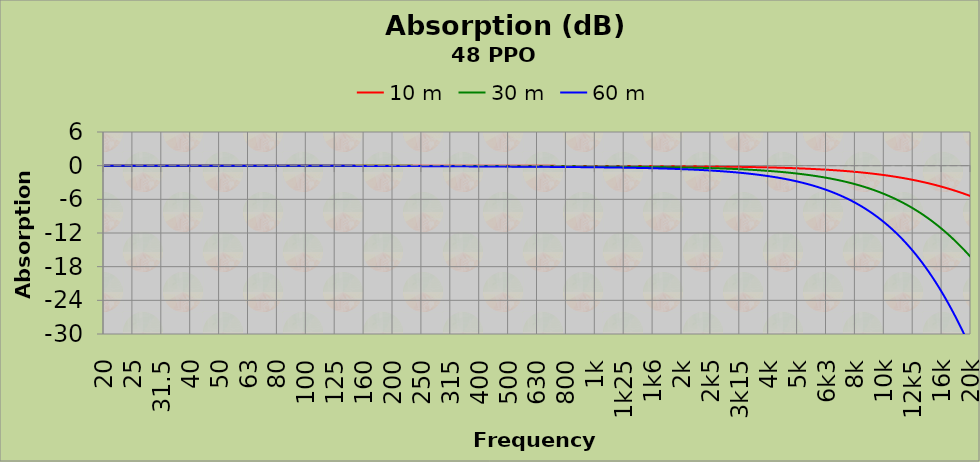
| Category | 10 m | 30 m | 60 m |
|---|---|---|---|
| 20 | 0 | 0 | -0.001 |
|  | 0 | 0 | -0.001 |
|  | 0 | 0 | -0.001 |
|  | 0 | 0 | -0.001 |
|  | 0 | 0 | -0.001 |
|  | 0 | 0 | -0.001 |
|  | 0 | 0 | -0.001 |
|  | 0 | 0 | -0.001 |
|  | 0 | -0.001 | -0.001 |
|  | 0 | -0.001 | -0.001 |
|  | 0 | -0.001 | -0.001 |
|  | 0 | -0.001 | -0.001 |
|  | 0 | -0.001 | -0.001 |
|  | 0 | -0.001 | -0.001 |
|  | 0 | -0.001 | -0.001 |
|  | 0 | -0.001 | -0.001 |
| 25 | 0 | -0.001 | -0.001 |
|  | 0 | -0.001 | -0.001 |
|  | 0 | -0.001 | -0.001 |
|  | 0 | -0.001 | -0.001 |
|  | 0 | -0.001 | -0.001 |
|  | 0 | -0.001 | -0.001 |
|  | 0 | -0.001 | -0.002 |
|  | 0 | -0.001 | -0.002 |
|  | 0 | -0.001 | -0.002 |
|  | 0 | -0.001 | -0.002 |
|  | 0 | -0.001 | -0.002 |
|  | 0 | -0.001 | -0.002 |
|  | 0 | -0.001 | -0.002 |
|  | 0 | -0.001 | -0.002 |
|  | 0 | -0.001 | -0.002 |
|  | 0 | -0.001 | -0.002 |
| 31,5 | 0 | -0.001 | -0.002 |
|  | 0 | -0.001 | -0.002 |
|  | 0 | -0.001 | -0.002 |
|  | 0 | -0.001 | -0.002 |
|  | 0 | -0.001 | -0.002 |
|  | 0 | -0.001 | -0.002 |
|  | 0 | -0.001 | -0.002 |
|  | 0 | -0.001 | -0.002 |
|  | 0 | -0.001 | -0.003 |
|  | 0 | -0.001 | -0.003 |
|  | 0 | -0.001 | -0.003 |
|  | 0 | -0.001 | -0.003 |
|  | 0 | -0.001 | -0.003 |
|  | 0 | -0.001 | -0.003 |
|  | -0.001 | -0.002 | -0.003 |
|  | -0.001 | -0.002 | -0.003 |
| 40 | -0.001 | -0.002 | -0.003 |
|  | -0.001 | -0.002 | -0.003 |
|  | -0.001 | -0.002 | -0.003 |
|  | -0.001 | -0.002 | -0.004 |
|  | -0.001 | -0.002 | -0.004 |
|  | -0.001 | -0.002 | -0.004 |
|  | -0.001 | -0.002 | -0.004 |
|  | -0.001 | -0.002 | -0.004 |
|  | -0.001 | -0.002 | -0.004 |
|  | -0.001 | -0.002 | -0.004 |
|  | -0.001 | -0.002 | -0.004 |
|  | -0.001 | -0.002 | -0.004 |
|  | -0.001 | -0.002 | -0.005 |
|  | -0.001 | -0.002 | -0.005 |
|  | -0.001 | -0.002 | -0.005 |
|  | -0.001 | -0.002 | -0.005 |
| 50 | -0.001 | -0.003 | -0.005 |
|  | -0.001 | -0.003 | -0.005 |
|  | -0.001 | -0.003 | -0.005 |
|  | -0.001 | -0.003 | -0.006 |
|  | -0.001 | -0.003 | -0.006 |
|  | -0.001 | -0.003 | -0.006 |
|  | -0.001 | -0.003 | -0.006 |
|  | -0.001 | -0.003 | -0.006 |
|  | -0.001 | -0.003 | -0.006 |
|  | -0.001 | -0.003 | -0.007 |
|  | -0.001 | -0.003 | -0.007 |
|  | -0.001 | -0.003 | -0.007 |
|  | -0.001 | -0.004 | -0.007 |
|  | -0.001 | -0.004 | -0.007 |
|  | -0.001 | -0.004 | -0.007 |
|  | -0.001 | -0.004 | -0.008 |
| 63 | -0.001 | -0.004 | -0.008 |
|  | -0.001 | -0.004 | -0.008 |
|  | -0.001 | -0.004 | -0.008 |
|  | -0.001 | -0.004 | -0.009 |
|  | -0.001 | -0.004 | -0.009 |
|  | -0.002 | -0.005 | -0.009 |
|  | -0.002 | -0.005 | -0.009 |
|  | -0.002 | -0.005 | -0.01 |
|  | -0.002 | -0.005 | -0.01 |
|  | -0.002 | -0.005 | -0.01 |
|  | -0.002 | -0.005 | -0.01 |
|  | -0.002 | -0.005 | -0.011 |
|  | -0.002 | -0.006 | -0.011 |
|  | -0.002 | -0.006 | -0.011 |
|  | -0.002 | -0.006 | -0.012 |
|  | -0.002 | -0.006 | -0.012 |
| 80 | -0.002 | -0.006 | -0.012 |
|  | -0.002 | -0.006 | -0.013 |
|  | -0.002 | -0.006 | -0.013 |
|  | -0.002 | -0.007 | -0.013 |
|  | -0.002 | -0.007 | -0.014 |
|  | -0.002 | -0.007 | -0.014 |
|  | -0.002 | -0.007 | -0.014 |
|  | -0.002 | -0.007 | -0.015 |
|  | -0.003 | -0.008 | -0.015 |
|  | -0.003 | -0.008 | -0.016 |
|  | -0.003 | -0.008 | -0.016 |
|  | -0.003 | -0.008 | -0.017 |
|  | -0.003 | -0.008 | -0.017 |
|  | -0.003 | -0.009 | -0.017 |
|  | -0.003 | -0.009 | -0.018 |
|  | -0.003 | -0.009 | -0.018 |
| 100 | -0.003 | -0.009 | -0.019 |
|  | -0.003 | -0.01 | -0.019 |
|  | -0.003 | -0.01 | -0.02 |
|  | -0.003 | -0.01 | -0.02 |
|  | -0.003 | -0.01 | -0.021 |
|  | -0.004 | -0.011 | -0.021 |
|  | -0.004 | -0.011 | -0.022 |
|  | -0.004 | -0.011 | -0.023 |
|  | -0.004 | -0.012 | -0.023 |
|  | -0.004 | -0.012 | -0.024 |
|  | -0.004 | -0.012 | -0.024 |
|  | -0.004 | -0.013 | -0.025 |
|  | -0.004 | -0.013 | -0.026 |
|  | -0.004 | -0.013 | -0.026 |
|  | -0.005 | -0.014 | -0.027 |
|  | -0.005 | -0.014 | -0.028 |
| 125 | -0.005 | -0.014 | -0.028 |
|  | -0.005 | -0.015 | -0.029 |
|  | -0.005 | -0.015 | -0.03 |
|  | -0.005 | -0.015 | -0.031 |
|  | -0.005 | -0.016 | -0.031 |
|  | -0.005 | -0.016 | -0.032 |
|  | -0.006 | -0.017 | -0.033 |
|  | -0.006 | -0.017 | -0.034 |
|  | -0.006 | -0.017 | -0.035 |
|  | -0.006 | -0.018 | -0.036 |
|  | -0.006 | -0.018 | -0.036 |
|  | -0.006 | -0.019 | -0.037 |
|  | -0.006 | -0.019 | -0.038 |
|  | -0.007 | -0.02 | -0.039 |
|  | -0.007 | -0.02 | -0.04 |
|  | -0.007 | -0.021 | -0.041 |
| 160 | -0.007 | -0.021 | -0.042 |
|  | -0.007 | -0.022 | -0.043 |
|  | -0.007 | -0.022 | -0.044 |
|  | -0.008 | -0.023 | -0.045 |
|  | -0.008 | -0.023 | -0.046 |
|  | -0.008 | -0.024 | -0.047 |
|  | -0.008 | -0.024 | -0.048 |
|  | -0.008 | -0.025 | -0.049 |
|  | -0.008 | -0.025 | -0.05 |
|  | -0.009 | -0.026 | -0.052 |
|  | -0.009 | -0.026 | -0.053 |
|  | -0.009 | -0.027 | -0.054 |
|  | -0.009 | -0.028 | -0.055 |
|  | -0.009 | -0.028 | -0.056 |
|  | -0.01 | -0.029 | -0.058 |
|  | -0.01 | -0.029 | -0.059 |
| 200 | -0.01 | -0.03 | -0.06 |
|  | -0.01 | -0.031 | -0.061 |
|  | -0.01 | -0.031 | -0.063 |
|  | -0.011 | -0.032 | -0.064 |
|  | -0.011 | -0.033 | -0.065 |
|  | -0.011 | -0.033 | -0.067 |
|  | -0.011 | -0.034 | -0.068 |
|  | -0.012 | -0.035 | -0.069 |
|  | -0.012 | -0.035 | -0.071 |
|  | -0.012 | -0.036 | -0.072 |
|  | -0.012 | -0.037 | -0.074 |
|  | -0.013 | -0.038 | -0.075 |
|  | -0.013 | -0.038 | -0.077 |
|  | -0.013 | -0.039 | -0.078 |
|  | -0.013 | -0.04 | -0.08 |
|  | -0.014 | -0.041 | -0.081 |
| 250 | -0.014 | -0.041 | -0.083 |
|  | -0.014 | -0.042 | -0.084 |
|  | -0.014 | -0.043 | -0.086 |
|  | -0.015 | -0.044 | -0.087 |
|  | -0.015 | -0.045 | -0.089 |
|  | -0.015 | -0.045 | -0.091 |
|  | -0.015 | -0.046 | -0.092 |
|  | -0.016 | -0.047 | -0.094 |
|  | -0.016 | -0.048 | -0.096 |
|  | -0.016 | -0.049 | -0.097 |
|  | -0.016 | -0.049 | -0.099 |
|  | -0.017 | -0.05 | -0.101 |
|  | -0.017 | -0.051 | -0.102 |
|  | -0.017 | -0.052 | -0.104 |
|  | -0.018 | -0.053 | -0.106 |
|  | -0.018 | -0.054 | -0.107 |
| 315 | -0.018 | -0.055 | -0.109 |
|  | -0.018 | -0.055 | -0.111 |
|  | -0.019 | -0.056 | -0.113 |
|  | -0.019 | -0.057 | -0.114 |
|  | -0.019 | -0.058 | -0.116 |
|  | -0.02 | -0.059 | -0.118 |
|  | -0.02 | -0.06 | -0.12 |
|  | -0.02 | -0.061 | -0.121 |
|  | -0.021 | -0.062 | -0.123 |
|  | -0.021 | -0.063 | -0.125 |
|  | -0.021 | -0.063 | -0.127 |
|  | -0.021 | -0.064 | -0.129 |
|  | -0.022 | -0.065 | -0.13 |
|  | -0.022 | -0.066 | -0.132 |
|  | -0.022 | -0.067 | -0.134 |
|  | -0.023 | -0.068 | -0.136 |
| 400 | -0.023 | -0.069 | -0.138 |
|  | -0.023 | -0.07 | -0.14 |
|  | -0.024 | -0.071 | -0.141 |
|  | -0.024 | -0.072 | -0.143 |
|  | -0.024 | -0.073 | -0.145 |
|  | -0.025 | -0.074 | -0.147 |
|  | -0.025 | -0.074 | -0.149 |
|  | -0.025 | -0.075 | -0.151 |
|  | -0.025 | -0.076 | -0.153 |
|  | -0.026 | -0.077 | -0.155 |
|  | -0.026 | -0.078 | -0.157 |
|  | -0.026 | -0.079 | -0.158 |
|  | -0.027 | -0.08 | -0.16 |
|  | -0.027 | -0.081 | -0.162 |
|  | -0.027 | -0.082 | -0.164 |
|  | -0.028 | -0.083 | -0.166 |
| 500 | -0.028 | -0.084 | -0.168 |
|  | -0.028 | -0.085 | -0.17 |
|  | -0.029 | -0.086 | -0.172 |
|  | -0.029 | -0.087 | -0.174 |
|  | -0.029 | -0.088 | -0.176 |
|  | -0.03 | -0.089 | -0.178 |
|  | -0.03 | -0.09 | -0.18 |
|  | -0.03 | -0.091 | -0.182 |
|  | -0.031 | -0.092 | -0.184 |
|  | -0.031 | -0.093 | -0.186 |
|  | -0.031 | -0.094 | -0.188 |
|  | -0.032 | -0.095 | -0.19 |
|  | -0.032 | -0.096 | -0.192 |
|  | -0.032 | -0.097 | -0.194 |
|  | -0.033 | -0.098 | -0.196 |
|  | -0.033 | -0.099 | -0.198 |
| 630 | -0.033 | -0.1 | -0.201 |
|  | -0.034 | -0.101 | -0.203 |
|  | -0.034 | -0.102 | -0.205 |
|  | -0.035 | -0.104 | -0.207 |
|  | -0.035 | -0.105 | -0.209 |
|  | -0.035 | -0.106 | -0.212 |
|  | -0.036 | -0.107 | -0.214 |
|  | -0.036 | -0.108 | -0.216 |
|  | -0.036 | -0.109 | -0.218 |
|  | -0.037 | -0.11 | -0.221 |
|  | -0.037 | -0.112 | -0.223 |
|  | -0.038 | -0.113 | -0.226 |
|  | -0.038 | -0.114 | -0.228 |
|  | -0.038 | -0.115 | -0.231 |
|  | -0.039 | -0.117 | -0.233 |
|  | -0.039 | -0.118 | -0.236 |
| 800 | -0.04 | -0.119 | -0.238 |
|  | -0.04 | -0.12 | -0.241 |
|  | -0.041 | -0.122 | -0.244 |
|  | -0.041 | -0.123 | -0.246 |
|  | -0.042 | -0.125 | -0.249 |
|  | -0.042 | -0.126 | -0.252 |
|  | -0.042 | -0.127 | -0.255 |
|  | -0.043 | -0.129 | -0.258 |
|  | -0.043 | -0.13 | -0.261 |
|  | -0.044 | -0.132 | -0.264 |
|  | -0.044 | -0.133 | -0.267 |
|  | -0.045 | -0.135 | -0.27 |
|  | -0.046 | -0.137 | -0.273 |
|  | -0.046 | -0.138 | -0.277 |
|  | -0.047 | -0.14 | -0.28 |
|  | -0.047 | -0.142 | -0.283 |
| 1k | -0.048 | -0.143 | -0.287 |
|  | -0.048 | -0.145 | -0.29 |
|  | -0.049 | -0.147 | -0.294 |
|  | -0.05 | -0.149 | -0.298 |
|  | -0.05 | -0.151 | -0.302 |
|  | -0.051 | -0.153 | -0.306 |
|  | -0.052 | -0.155 | -0.31 |
|  | -0.052 | -0.157 | -0.314 |
|  | -0.053 | -0.159 | -0.318 |
|  | -0.054 | -0.161 | -0.322 |
|  | -0.054 | -0.163 | -0.327 |
|  | -0.055 | -0.166 | -0.331 |
|  | -0.056 | -0.168 | -0.336 |
|  | -0.057 | -0.17 | -0.341 |
|  | -0.058 | -0.173 | -0.346 |
|  | -0.058 | -0.175 | -0.351 |
| 1k25 | -0.059 | -0.178 | -0.356 |
|  | -0.06 | -0.181 | -0.361 |
|  | -0.061 | -0.183 | -0.366 |
|  | -0.062 | -0.186 | -0.372 |
|  | -0.063 | -0.189 | -0.378 |
|  | -0.064 | -0.192 | -0.383 |
|  | -0.065 | -0.195 | -0.389 |
|  | -0.066 | -0.198 | -0.396 |
|  | -0.067 | -0.201 | -0.402 |
|  | -0.068 | -0.204 | -0.408 |
|  | -0.069 | -0.208 | -0.415 |
|  | -0.07 | -0.211 | -0.422 |
|  | -0.071 | -0.214 | -0.429 |
|  | -0.073 | -0.218 | -0.436 |
|  | -0.074 | -0.222 | -0.444 |
|  | -0.075 | -0.226 | -0.451 |
| 1k6 | -0.076 | -0.229 | -0.459 |
|  | -0.078 | -0.233 | -0.467 |
|  | -0.079 | -0.238 | -0.475 |
|  | -0.081 | -0.242 | -0.484 |
|  | -0.082 | -0.246 | -0.492 |
|  | -0.084 | -0.251 | -0.501 |
|  | -0.085 | -0.255 | -0.511 |
|  | -0.087 | -0.26 | -0.52 |
|  | -0.088 | -0.265 | -0.53 |
|  | -0.09 | -0.27 | -0.54 |
|  | -0.092 | -0.275 | -0.55 |
|  | -0.093 | -0.28 | -0.561 |
|  | -0.095 | -0.286 | -0.572 |
|  | -0.097 | -0.291 | -0.583 |
|  | -0.099 | -0.297 | -0.594 |
|  | -0.101 | -0.303 | -0.606 |
| 2k | -0.103 | -0.309 | -0.618 |
|  | -0.105 | -0.315 | -0.631 |
|  | -0.107 | -0.322 | -0.644 |
|  | -0.109 | -0.328 | -0.657 |
|  | -0.112 | -0.335 | -0.671 |
|  | -0.114 | -0.342 | -0.685 |
|  | -0.116 | -0.349 | -0.699 |
|  | -0.119 | -0.357 | -0.714 |
|  | -0.121 | -0.364 | -0.729 |
|  | -0.124 | -0.372 | -0.745 |
|  | -0.127 | -0.38 | -0.761 |
|  | -0.13 | -0.389 | -0.777 |
|  | -0.132 | -0.397 | -0.794 |
|  | -0.135 | -0.406 | -0.812 |
|  | -0.138 | -0.415 | -0.83 |
|  | -0.141 | -0.424 | -0.848 |
| 2k5 | -0.145 | -0.434 | -0.867 |
|  | -0.148 | -0.444 | -0.887 |
|  | -0.151 | -0.454 | -0.907 |
|  | -0.155 | -0.464 | -0.928 |
|  | -0.158 | -0.475 | -0.949 |
|  | -0.162 | -0.486 | -0.971 |
|  | -0.166 | -0.497 | -0.994 |
|  | -0.17 | -0.509 | -1.017 |
|  | -0.174 | -0.521 | -1.041 |
|  | -0.178 | -0.533 | -1.066 |
|  | -0.182 | -0.546 | -1.091 |
|  | -0.186 | -0.559 | -1.117 |
|  | -0.191 | -0.572 | -1.144 |
|  | -0.195 | -0.586 | -1.171 |
|  | -0.2 | -0.6 | -1.2 |
|  | -0.205 | -0.614 | -1.229 |
| 3k15 | -0.21 | -0.629 | -1.259 |
|  | -0.215 | -0.645 | -1.29 |
|  | -0.22 | -0.661 | -1.321 |
|  | -0.226 | -0.677 | -1.354 |
|  | -0.231 | -0.694 | -1.388 |
|  | -0.237 | -0.711 | -1.422 |
|  | -0.243 | -0.729 | -1.458 |
|  | -0.249 | -0.747 | -1.494 |
|  | -0.255 | -0.766 | -1.532 |
|  | -0.262 | -0.785 | -1.57 |
|  | -0.268 | -0.805 | -1.61 |
|  | -0.275 | -0.825 | -1.651 |
|  | -0.282 | -0.846 | -1.693 |
|  | -0.289 | -0.868 | -1.736 |
|  | -0.297 | -0.89 | -1.781 |
|  | -0.304 | -0.913 | -1.826 |
| 4k | -0.312 | -0.937 | -1.873 |
|  | -0.32 | -0.961 | -1.922 |
|  | -0.329 | -0.986 | -1.971 |
|  | -0.337 | -1.011 | -2.022 |
|  | -0.346 | -1.038 | -2.075 |
|  | -0.355 | -1.065 | -2.129 |
|  | -0.364 | -1.092 | -2.185 |
|  | -0.374 | -1.121 | -2.242 |
|  | -0.383 | -1.15 | -2.301 |
|  | -0.394 | -1.181 | -2.361 |
|  | -0.404 | -1.212 | -2.423 |
|  | -0.415 | -1.244 | -2.487 |
|  | -0.425 | -1.276 | -2.553 |
|  | -0.437 | -1.31 | -2.62 |
|  | -0.448 | -1.345 | -2.69 |
|  | -0.46 | -1.381 | -2.761 |
| 5k | -0.472 | -1.417 | -2.835 |
|  | -0.485 | -1.455 | -2.91 |
|  | -0.498 | -1.494 | -2.988 |
|  | -0.511 | -1.534 | -3.067 |
|  | -0.525 | -1.575 | -3.149 |
|  | -0.539 | -1.617 | -3.234 |
|  | -0.553 | -1.66 | -3.32 |
|  | -0.568 | -1.705 | -3.409 |
|  | -0.583 | -1.75 | -3.501 |
|  | -0.599 | -1.797 | -3.595 |
|  | -0.615 | -1.846 | -3.691 |
|  | -0.632 | -1.895 | -3.791 |
|  | -0.649 | -1.946 | -3.893 |
|  | -0.666 | -1.999 | -3.998 |
|  | -0.684 | -2.053 | -4.105 |
|  | -0.703 | -2.108 | -4.216 |
| 6k3 | -0.722 | -2.165 | -4.33 |
|  | -0.741 | -2.223 | -4.446 |
|  | -0.761 | -2.283 | -4.566 |
|  | -0.782 | -2.345 | -4.69 |
|  | -0.803 | -2.408 | -4.816 |
|  | -0.824 | -2.473 | -4.946 |
|  | -0.847 | -2.54 | -5.08 |
|  | -0.87 | -2.609 | -5.217 |
|  | -0.893 | -2.679 | -5.358 |
|  | -0.917 | -2.751 | -5.503 |
|  | -0.942 | -2.826 | -5.651 |
|  | -0.967 | -2.902 | -5.804 |
|  | -0.993 | -2.98 | -5.961 |
|  | -1.02 | -3.061 | -6.121 |
|  | -1.048 | -3.143 | -6.287 |
|  | -1.076 | -3.228 | -6.456 |
| 8k | -1.105 | -3.315 | -6.63 |
|  | -1.135 | -3.404 | -6.808 |
|  | -1.165 | -3.496 | -6.992 |
|  | -1.197 | -3.59 | -7.18 |
|  | -1.229 | -3.686 | -7.373 |
|  | -1.262 | -3.785 | -7.571 |
|  | -1.296 | -3.887 | -7.774 |
|  | -1.33 | -3.991 | -7.982 |
|  | -1.366 | -4.098 | -8.196 |
|  | -1.402 | -4.207 | -8.415 |
|  | -1.44 | -4.32 | -8.64 |
|  | -1.478 | -4.435 | -8.87 |
|  | -1.518 | -4.553 | -9.107 |
|  | -1.558 | -4.675 | -9.349 |
|  | -1.6 | -4.799 | -9.598 |
|  | -1.642 | -4.926 | -9.852 |
| 10k | -1.686 | -5.057 | -10.113 |
|  | -1.73 | -5.191 | -10.381 |
|  | -1.776 | -5.328 | -10.655 |
|  | -1.823 | -5.468 | -10.936 |
|  | -1.871 | -5.612 | -11.224 |
|  | -1.92 | -5.759 | -11.519 |
|  | -1.97 | -5.91 | -11.821 |
|  | -2.022 | -6.065 | -12.13 |
|  | -2.075 | -6.224 | -12.447 |
|  | -2.129 | -6.386 | -12.771 |
|  | -2.184 | -6.552 | -13.103 |
|  | -2.241 | -6.722 | -13.443 |
|  | -2.299 | -6.896 | -13.791 |
|  | -2.358 | -7.074 | -14.147 |
|  | -2.419 | -7.256 | -14.511 |
|  | -2.481 | -7.442 | -14.884 |
| 12k5 | -2.544 | -7.633 | -15.265 |
|  | -2.609 | -7.827 | -15.655 |
|  | -2.676 | -8.027 | -16.053 |
|  | -2.744 | -8.231 | -16.461 |
|  | -2.813 | -8.439 | -16.878 |
|  | -2.884 | -8.652 | -17.303 |
|  | -2.956 | -8.869 | -17.738 |
|  | -3.031 | -9.092 | -18.183 |
|  | -3.106 | -9.319 | -18.637 |
|  | -3.184 | -9.551 | -19.101 |
|  | -3.262 | -9.787 | -19.575 |
|  | -3.343 | -10.029 | -20.058 |
|  | -3.425 | -10.276 | -20.552 |
|  | -3.509 | -10.528 | -21.056 |
|  | -3.595 | -10.785 | -21.57 |
|  | -3.682 | -11.047 | -22.094 |
| 16k | -3.772 | -11.315 | -22.629 |
|  | -3.863 | -11.588 | -23.175 |
|  | -3.955 | -11.866 | -23.731 |
|  | -4.05 | -12.149 | -24.298 |
|  | -4.146 | -12.438 | -24.876 |
|  | -4.244 | -12.733 | -25.465 |
|  | -4.344 | -13.033 | -26.065 |
|  | -4.446 | -13.338 | -26.676 |
|  | -4.55 | -13.649 | -27.299 |
|  | -4.655 | -13.966 | -27.932 |
|  | -4.763 | -14.288 | -28.577 |
|  | -4.872 | -14.616 | -29.233 |
|  | -4.983 | -14.95 | -29.9 |
|  | -5.097 | -15.29 | -30.579 |
|  | -5.212 | -15.635 | -31.27 |
|  | -5.329 | -15.986 | -31.971 |
| 20k | -5.447 | -16.342 | -32.685 |